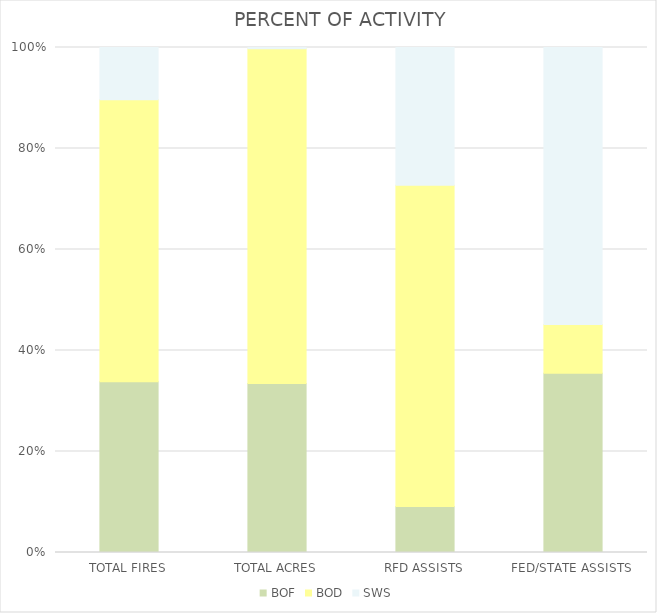
| Category | BOF | BOD | SWS |
|---|---|---|---|
| TOTAL FIRES | 49 | 81 | 15 |
| TOTAL ACRES | 9135.95 | 18084.75 | 64.85 |
| RFD ASSISTS | 1 | 7 | 3 |
| FED/STATE ASSISTS | 11 | 3 | 17 |